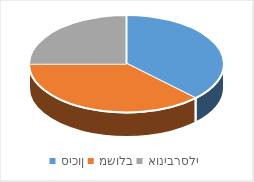
| Category | Series 0 |
|---|---|
| סיכון | 3 |
| משולב | 3 |
| אוניברסלי | 2 |